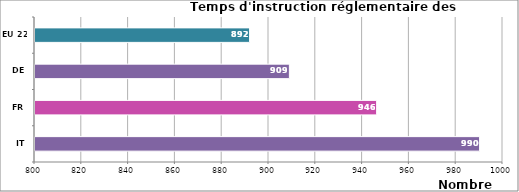
| Category | Series 0 |
|---|---|
| IT | 990 |
| FR | 946 |
| DE | 908.711 |
| EU 22 | 891.71 |